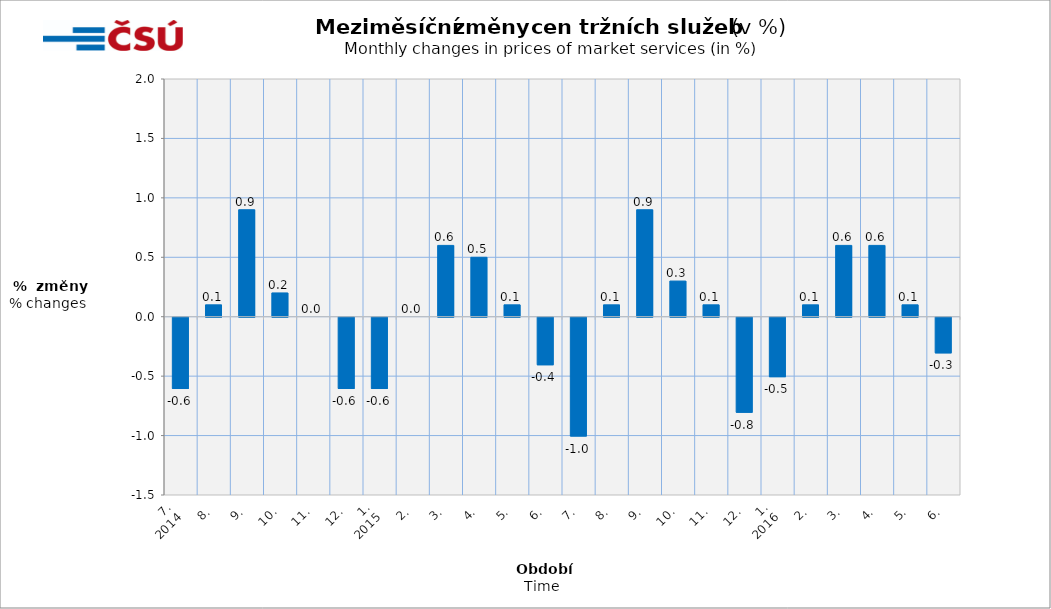
| Category | Meziměsíční změny v % |
|---|---|
| 0 | -0.6 |
| 1 | 0.1 |
| 2 | 0.9 |
| 3 | 0.2 |
| 4 | 0 |
| 5 | -0.6 |
| 6 | -0.6 |
| 7 | 0 |
| 8 | 0.6 |
| 9 | 0.5 |
| 10 | 0.1 |
| 11 | -0.4 |
| 12 | -1 |
| 13 | 0.1 |
| 14 | 0.9 |
| 15 | 0.3 |
| 16 | 0.1 |
| 17 | -0.8 |
| 18 | -0.5 |
| 19 | 0.1 |
| 20 | 0.6 |
| 21 | 0.6 |
| 22 | 0.1 |
| 23 | -0.3 |